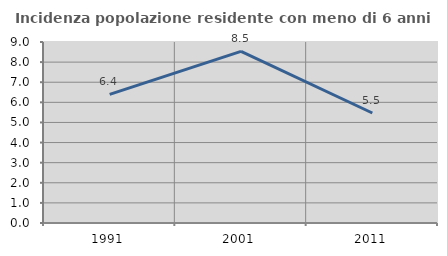
| Category | Incidenza popolazione residente con meno di 6 anni |
|---|---|
| 1991.0 | 6.392 |
| 2001.0 | 8.531 |
| 2011.0 | 5.469 |